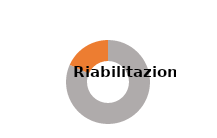
| Category | Series 0 |
|---|---|
| Donne  | 0.817 |
| Uomini  | 0.183 |